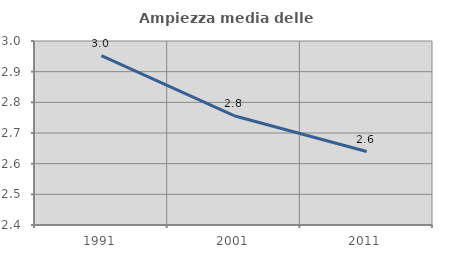
| Category | Ampiezza media delle famiglie |
|---|---|
| 1991.0 | 2.952 |
| 2001.0 | 2.756 |
| 2011.0 | 2.639 |